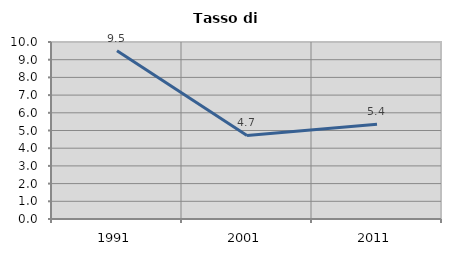
| Category | Tasso di disoccupazione   |
|---|---|
| 1991.0 | 9.509 |
| 2001.0 | 4.72 |
| 2011.0 | 5.352 |